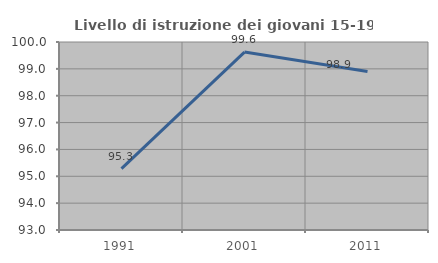
| Category | Livello di istruzione dei giovani 15-19 anni |
|---|---|
| 1991.0 | 95.287 |
| 2001.0 | 99.624 |
| 2011.0 | 98.901 |